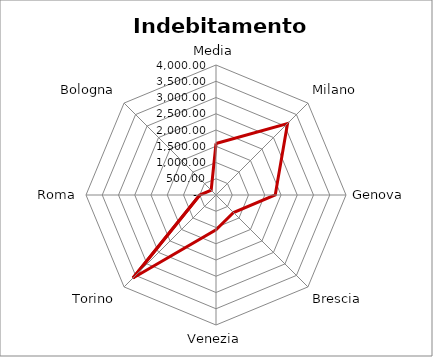
| Category | Indebitamento procapite |
|---|---|
| Media | 1584.479 |
| Milano | 3112.58 |
| Genova | 1822.65 |
| Brescia | 762.58 |
| Venezia | 1073.49 |
| Torino | 3611.07 |
| Roma | 498.96 |
| Bologna | 210.02 |